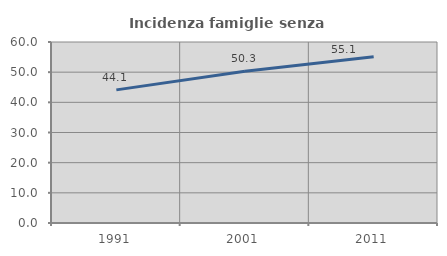
| Category | Incidenza famiglie senza nuclei |
|---|---|
| 1991.0 | 44.134 |
| 2001.0 | 50.296 |
| 2011.0 | 55.135 |